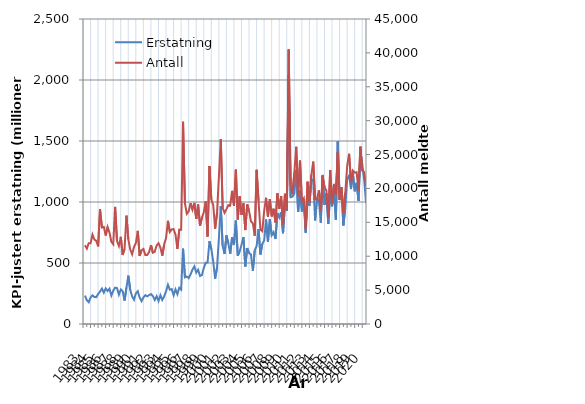
| Category | Erstatning |
|---|---|
| 1983.0 | 232.937 |
| nan | 195.121 |
| nan | 178.438 |
| nan | 218.579 |
| 1984.0 | 234.389 |
| nan | 221.715 |
| nan | 219.826 |
| nan | 245.877 |
| 1985.0 | 265.702 |
| nan | 290.42 |
| nan | 257.346 |
| nan | 291.865 |
| 1986.0 | 270.604 |
| nan | 289.558 |
| nan | 233.055 |
| nan | 272.728 |
| 1987.0 | 297.95 |
| nan | 294.021 |
| nan | 240.61 |
| nan | 283.085 |
| 1988.0 | 269.44 |
| nan | 192.069 |
| nan | 299.153 |
| nan | 396.293 |
| 1989.0 | 279.972 |
| nan | 226.285 |
| nan | 199.112 |
| nan | 251.201 |
| 1990.0 | 268.971 |
| nan | 216.388 |
| nan | 187.666 |
| nan | 218.436 |
| 1991.0 | 235.713 |
| nan | 226.637 |
| nan | 237.191 |
| nan | 245.226 |
| 1992.0 | 229.086 |
| nan | 197.393 |
| nan | 228.083 |
| nan | 188.213 |
| 1993.0 | 236.156 |
| nan | 196.535 |
| nan | 227.061 |
| nan | 268.62 |
| 1994.0 | 321.731 |
| nan | 281.266 |
| nan | 285.763 |
| nan | 235.54 |
| 1995.0 | 283.776 |
| nan | 244.132 |
| nan | 296.645 |
| nan | 281.65 |
| 1996.0 | 617.657 |
| nan | 382.464 |
| nan | 389.296 |
| nan | 375.446 |
| 1997.0 | 406.453 |
| nan | 446.013 |
| nan | 472.333 |
| nan | 421.43 |
| 1998.0 | 444.599 |
| nan | 393.872 |
| nan | 400.307 |
| nan | 460.108 |
| 1999.0 | 501.845 |
| nan | 504.283 |
| nan | 678.577 |
| nan | 614.541 |
| 2000.0 | 512.261 |
| nan | 372.014 |
| nan | 461.192 |
| nan | 703.176 |
| 2001.0 | 965.028 |
| nan | 638.852 |
| nan | 573.774 |
| nan | 725.942 |
| 2002.0 | 661.156 |
| nan | 575.27 |
| nan | 710.935 |
| nan | 647.82 |
| 2003.0 | 847.26 |
| nan | 560.178 |
| nan | 595.958 |
| nan | 649.208 |
| 2004.0 | 712.217 |
| nan | 470.87 |
| nan | 622.509 |
| nan | 581.854 |
| 2005.0 | 569.493 |
| nan | 434.602 |
| nan | 603.345 |
| nan | 639.394 |
| 2006.0 | 777.195 |
| nan | 569.965 |
| nan | 655.815 |
| nan | 684.196 |
| 2007.0 | 856.408 |
| nan | 673.317 |
| nan | 860.276 |
| nan | 727.347 |
| 2008.0 | 752.172 |
| nan | 696.322 |
| nan | 909.437 |
| nan | 873.42 |
| 2009.0 | 916.557 |
| nan | 744.098 |
| nan | 982.934 |
| nan | 929.078 |
| 2010.0 | 2038.021 |
| nan | 1039.492 |
| nan | 1044.493 |
| nan | 1068.56 |
| 2011.0 | 1262.842 |
| nan | 918.31 |
| nan | 1094.943 |
| nan | 922.779 |
| 2012.0 | 1022.313 |
| nan | 747.404 |
| nan | 1030.461 |
| nan | 970.277 |
| 2013.0 | 1191.601 |
| nan | 1166.802 |
| nan | 849.019 |
| nan | 1025.516 |
| 2014.0 | 1011.435 |
| nan | 830.588 |
| nan | 1221.838 |
| nan | 976.933 |
| 2015.0 | 1071.822 |
| nan | 820.828 |
| nan | 1086.542 |
| nan | 964.725 |
| 2016.0 | 1109.027 |
| nan | 853.659 |
| nan | 1497.167 |
| nan | 1015.828 |
| 2017.0 | 1088.954 |
| nan | 807.65 |
| nan | 953.843 |
| nan | 1191.034 |
| 2018.0 | 1215.874 |
| nan | 1106.121 |
| nan | 1232.942 |
| nan | 1087.816 |
| 2019.0 | 1157.146 |
| nan | 1008.947 |
| nan | 1404.229 |
| nan | 1307.73 |
| 2020.0 | 1182.332 |
| nan | 993.156 |